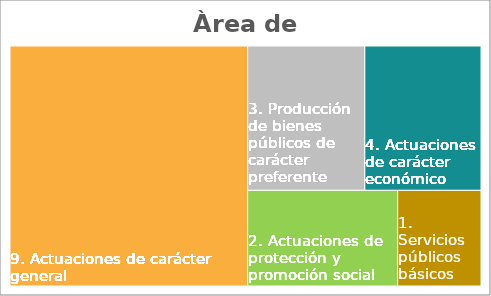
| Category | Series 0 |
|---|---|
| 60. Inv. nueva en infraestruc. y bienes para uso general. | 0.02 |
| 61. Inv. de reposición infraest. y bienes uso gral. | 0.552 |
| 62. Inv.nueva asociada al funcionam. operativo serv. | 0.103 |
| 63. Inv. reposición assoc. funcionamiento operativo serv. | 0.163 |
| 64. Gastos en inversiones de carácter immaterial | 0.07 |
| 65. Gastos inv. gestionadas por otros entes púbicos | 0.089 |
| 68. Gastos en inversiones de bienes patrimoniales  | 0.003 |